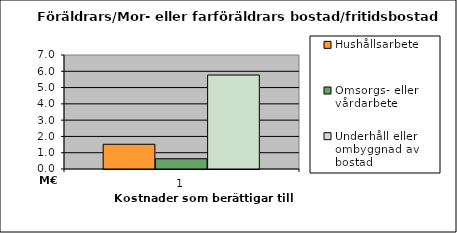
| Category | Hushållsarbete | Omsorgs- eller vårdarbete | Underhåll eller ombyggnad av bostad |
|---|---|---|---|
| 0 | 1519137.72 | 628530.51 | 5770328.67 |